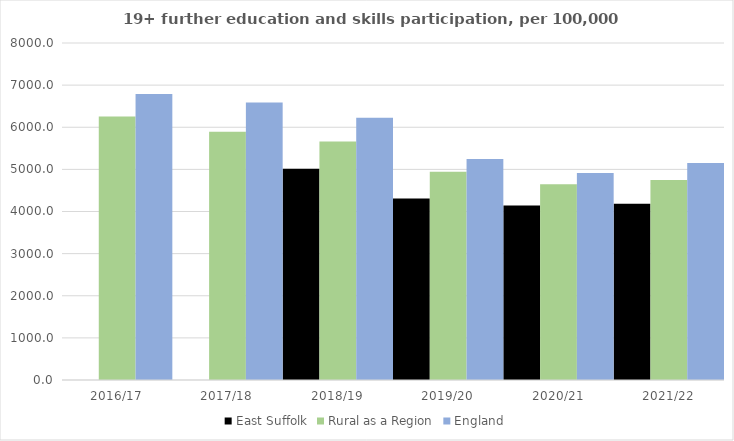
| Category | East Suffolk | Rural as a Region | England |
|---|---|---|---|
| 2016/17 | 0 | 6253.401 | 6788 |
| 2017/18 | 0 | 5892.029 | 6588 |
| 2018/19 | 5013 | 5661.873 | 6227 |
| 2019/20 | 4309 | 4943.801 | 5244 |
| 2020/21 | 4143 | 4646.727 | 4913 |
| 2021/22 | 4182 | 4747.049 | 5151 |